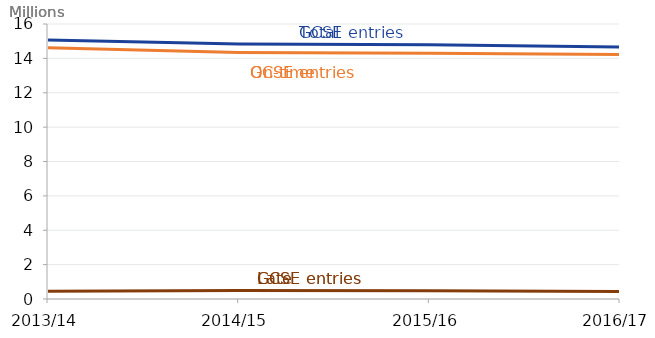
| Category | Total GCSE Entries | On-time entries | Late entries |
|---|---|---|---|
| 2013/14 | 15075000 | 14624575 | 450425 |
| 2014/15 | 14843325 | 14347670 | 495655 |
| 2015/16 | 14791035 | 14305250 | 485785 |
| 2016/17 | 14662475 | 14224525 | 437945 |